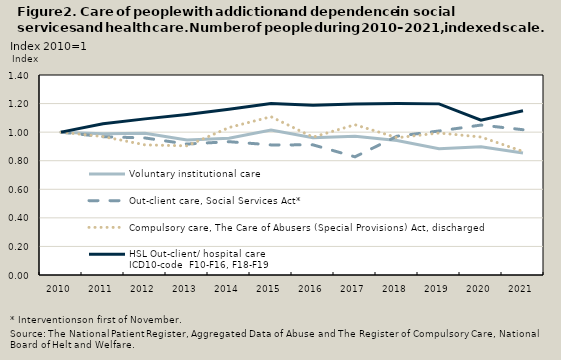
| Category | Voluntary institutional care | Out-client care, Social Services Act* | Compulsory care, The Care of Abusers (Special Provisions) Act, discharged | HSL Out-client/ hospital care 
ICD10-code  F10-F16, F18-F19 |
|---|---|---|---|---|
| 2010.0 | 1 | 1 | 1 | 1 |
| 2011.0 | 0.988 | 0.968 | 0.969 | 1.059 |
| 2012.0 | 0.993 | 0.959 | 0.911 | 1.093 |
| 2013.0 | 0.944 | 0.917 | 0.904 | 1.124 |
| 2014.0 | 0.958 | 0.933 | 1.032 | 1.16 |
| 2015.0 | 1.015 | 0.911 | 1.108 | 1.2 |
| 2016.0 | 0.961 | 0.911 | 0.965 | 1.189 |
| 2017.0 | 0.972 | 0.827 | 1.052 | 1.197 |
| 2018.0 | 0.941 | 0.971 | 0.961 | 1.2 |
| 2019.0 | 0.884 | 1.008 | 0.994 | 1.198 |
| 2020.0 | 0.897 | 1.05 | 0.966 | 1.084 |
| 2021.0 | 0.855 | 1.017 | 0.865 | 1.149 |